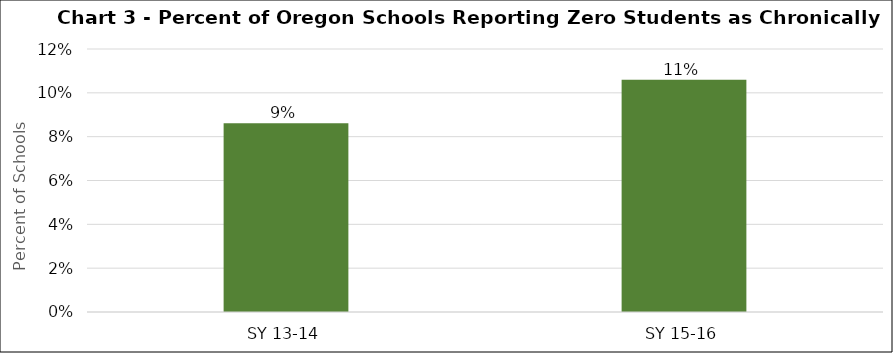
| Category | Series 0 |
|---|---|
| SY 13-14 | 0.086 |
| SY 15-16 | 0.106 |